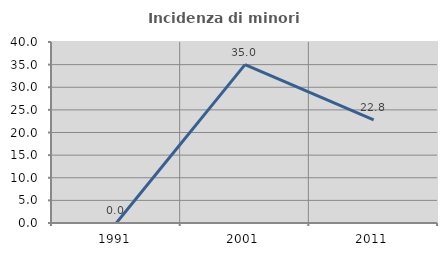
| Category | Incidenza di minori stranieri |
|---|---|
| 1991.0 | 0 |
| 2001.0 | 35 |
| 2011.0 | 22.785 |